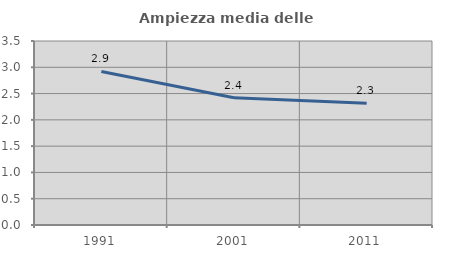
| Category | Ampiezza media delle famiglie |
|---|---|
| 1991.0 | 2.921 |
| 2001.0 | 2.422 |
| 2011.0 | 2.316 |